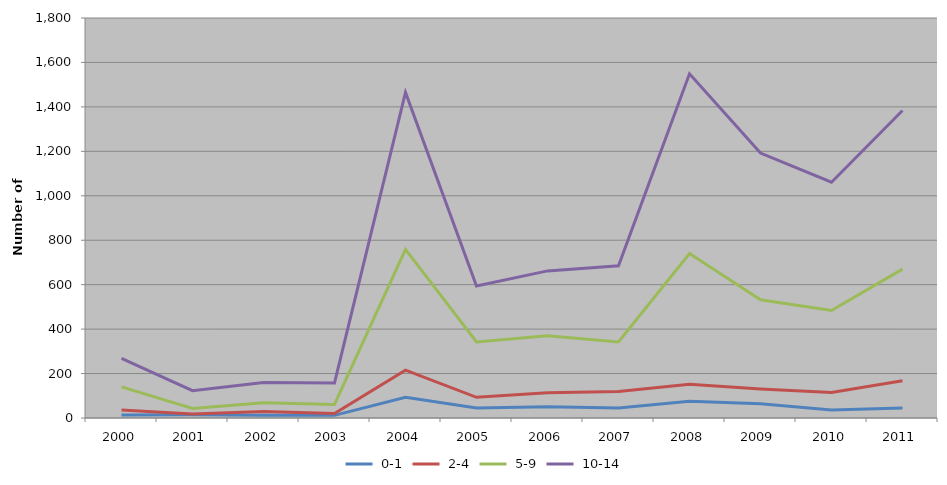
| Category |  0-1 |  2-4 |  5-9 |  10-14 |
|---|---|---|---|---|
| 2000 | 13 | 36 | 140 | 268 |
| 2001 | 15 | 18 | 43 | 123 |
| 2002 | 12 | 29 | 69 | 160 |
| 2003 | 12 | 20 | 61 | 158 |
| 2004 | 93 | 215 | 759 | 1465 |
| 2005 | 45 | 93 | 342 | 594 |
| 2006 | 51 | 114 | 370 | 662 |
| 2007 | 45 | 119 | 342 | 685 |
| 2008 | 75 | 152 | 740 | 1549 |
| 2009 | 64 | 131 | 532 | 1192 |
| 2010 | 36 | 115 | 484 | 1061 |
| 2011 | 45 | 168 | 670 | 1384 |